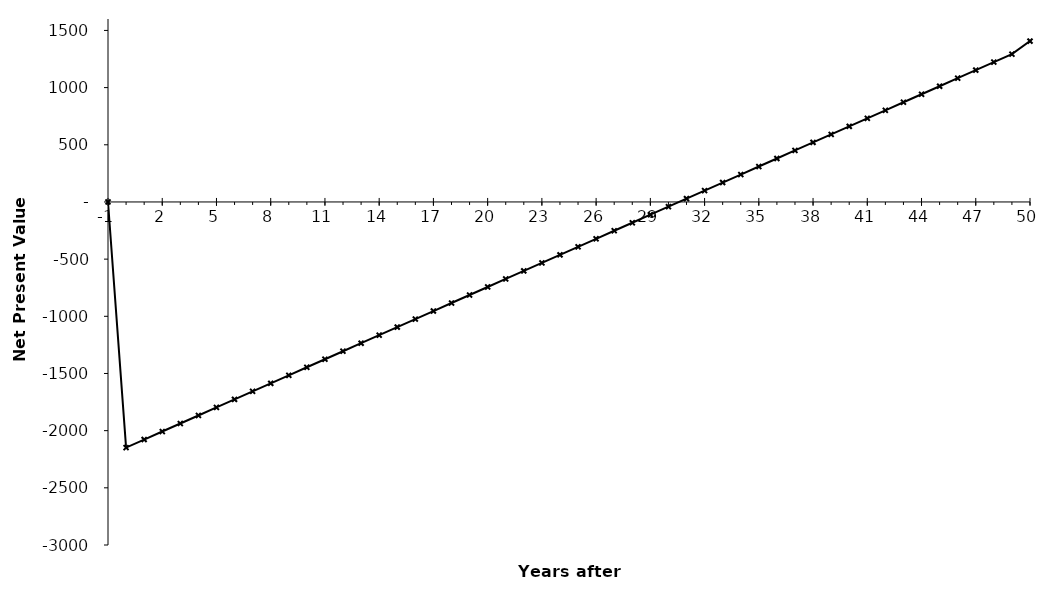
| Category | Net Present Value |
|---|---|
| -1.0 | 0 |
| 0.0 | -2148096495.818 |
| 1.0 | -2077868062.981 |
| 2.0 | -2007639630.144 |
| 3.0 | -1937411197.307 |
| 4.0 | -1867182764.47 |
| 5.0 | -1796954331.633 |
| 6.0 | -1726725898.796 |
| 7.0 | -1656497465.959 |
| 8.0 | -1586269033.122 |
| 9.0 | -1516040600.285 |
| 10.0 | -1445812167.448 |
| 11.0 | -1375583734.611 |
| 12.0 | -1305355301.774 |
| 13.0 | -1235126868.937 |
| 14.0 | -1164898436.1 |
| 15.0 | -1094670003.263 |
| 16.0 | -1024441570.426 |
| 17.0 | -954213137.589 |
| 18.0 | -883984704.752 |
| 19.0 | -813756271.915 |
| 20.0 | -743527839.078 |
| 21.0 | -673299406.241 |
| 22.0 | -603070973.405 |
| 23.0 | -532842540.568 |
| 24.0 | -462614107.731 |
| 25.0 | -392385674.894 |
| 26.0 | -322157242.057 |
| 27.0 | -251928809.22 |
| 28.0 | -181700376.383 |
| 29.0 | -111471943.546 |
| 30.0 | -41243510.709 |
| 31.0 | 28984922.128 |
| 32.0 | 99213354.965 |
| 33.0 | 169441787.802 |
| 34.0 | 239670220.639 |
| 35.0 | 309898653.476 |
| 36.0 | 380127086.313 |
| 37.0 | 450355519.15 |
| 38.0 | 520583951.987 |
| 39.0 | 590812384.824 |
| 40.0 | 661040817.661 |
| 41.0 | 731269250.498 |
| 42.0 | 801497683.335 |
| 43.0 | 871726116.172 |
| 44.0 | 941954549.009 |
| 45.0 | 1012182981.846 |
| 46.0 | 1082411414.683 |
| 47.0 | 1152639847.519 |
| 48.0 | 1222868280.356 |
| 49.0 | 1293096713.193 |
| 50.0 | 1406537370.167 |